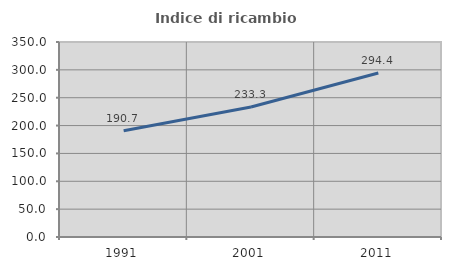
| Category | Indice di ricambio occupazionale  |
|---|---|
| 1991.0 | 190.741 |
| 2001.0 | 233.333 |
| 2011.0 | 294.444 |